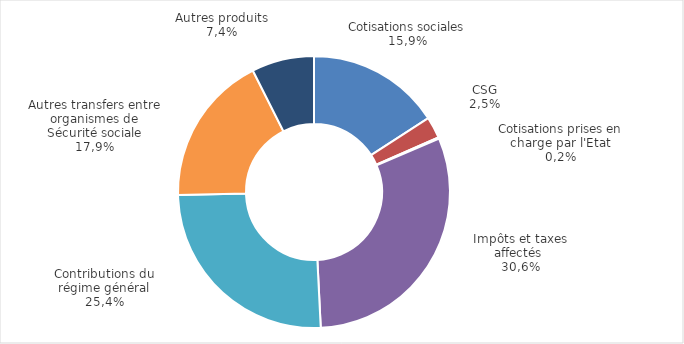
| Category | Series 0 |
|---|---|
| Cotisations sociales | 2614.652 |
| CSG | 418.358 |
| Cotisations prises en charge par l'Etat | 28.379 |
| Impôts et taxes affectés | 5044.846 |
| Contributions du Régime Général (transferts d'équilibrage) | 4189.324 |
| Autres transferts entre organismes de Sécurité sociale et assimilées* | 2953.459 |
| Autres produits** | 1223.896 |